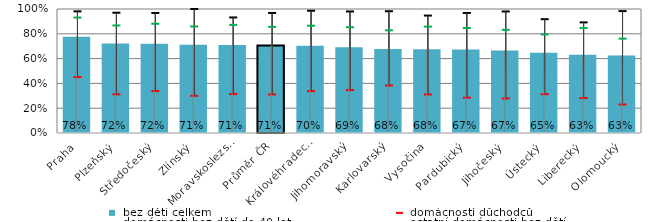
| Category |  bez dětí celkem |
|---|---|
| Praha | 0.777 |
| Plzeňský | 0.721 |
| Středočeský | 0.72 |
| Zlínský | 0.711 |
| Moravskoslezský | 0.71 |
| Průměr ČR | 0.705 |
| Královéhradecký | 0.703 |
| Jihomoravský | 0.691 |
| Karlovarský | 0.678 |
| Vysočina | 0.676 |
| Pardubický | 0.673 |
| Jihočeský | 0.665 |
| Ústecký | 0.648 |
| Liberecký | 0.631 |
| Olomoucký | 0.625 |